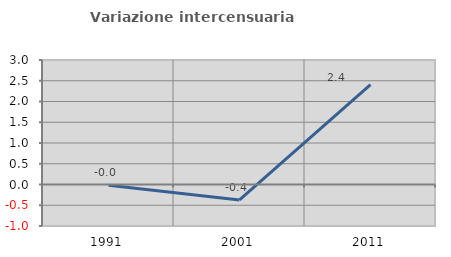
| Category | Variazione intercensuaria annua |
|---|---|
| 1991.0 | -0.018 |
| 2001.0 | -0.372 |
| 2011.0 | 2.408 |